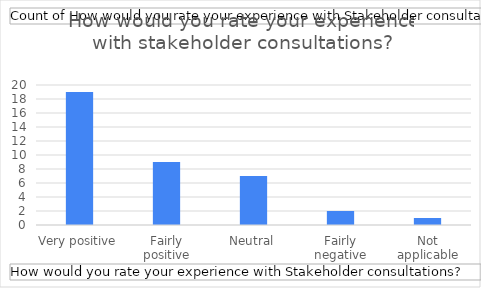
| Category | Total |
|---|---|
| Very positive | 19 |
| Fairly positive | 9 |
| Neutral | 7 |
| Fairly negative | 2 |
| Not applicable | 1 |